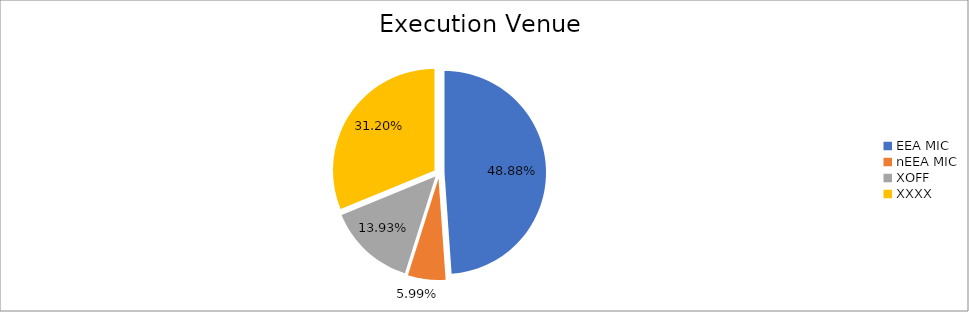
| Category | Series 0 |
|---|---|
| EEA MIC | 6192709.636 |
| nEEA MIC | 759503.816 |
| XOFF | 1764389.101 |
| XXXX | 3952612.349 |